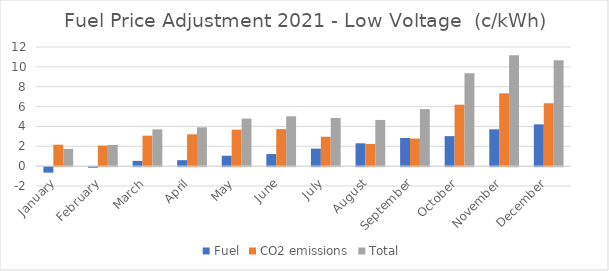
| Category | Fuel | CO2 emissions | Total |
|---|---|---|---|
| January | -0.555 | 2.159 | 1.735 |
| February | -0.058 | 2.07 | 2.138 |
| March | 0.533 | 3.067 | 3.704 |
| April | 0.602 | 3.207 | 3.91 |
| May | 1.049 | 3.671 | 4.79 |
| June | 1.219 | 3.728 | 5.022 |
| July | 1.765 | 2.964 | 4.853 |
| August | 2.302 | 2.234 | 4.652 |
| September | 2.834 | 2.779 | 5.744 |
| October | 3.024 | 6.188 | 9.345 |
| November | 3.708 | 7.333 | 11.177 |
| December | 4.21 | 6.334 | 10.678 |